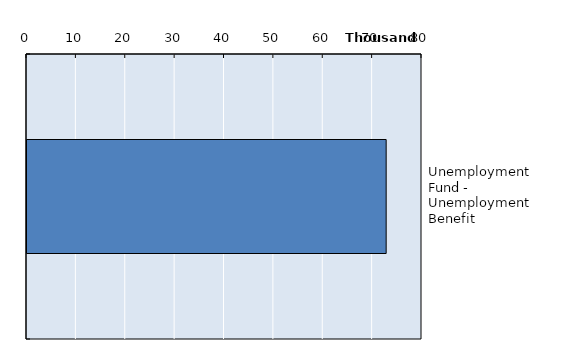
| Category | Series 0 |
|---|---|
| Unemployment Fund - Unemployment Benefit | 72743 |